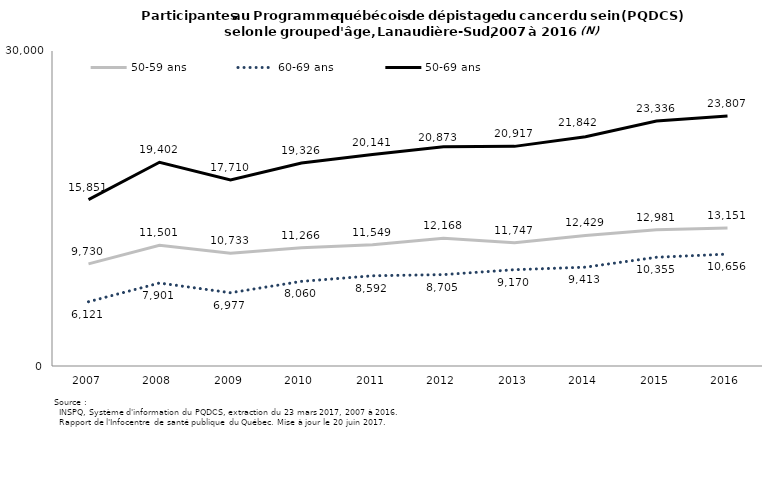
| Category | 50-59 ans | 60-69 ans | 50-69 ans |
|---|---|---|---|
| 2007.0 | 9730 | 6121 | 15851 |
| 2008.0 | 11501 | 7901 | 19402 |
| 2009.0 | 10733 | 6977 | 17710 |
| 2010.0 | 11266 | 8060 | 19326 |
| 2011.0 | 11549 | 8592 | 20141 |
| 2012.0 | 12168 | 8705 | 20873 |
| 2013.0 | 11747 | 9170 | 20917 |
| 2014.0 | 12429 | 9413 | 21842 |
| 2015.0 | 12981 | 10355 | 23336 |
| 2016.0 | 13151 | 10656 | 23807 |